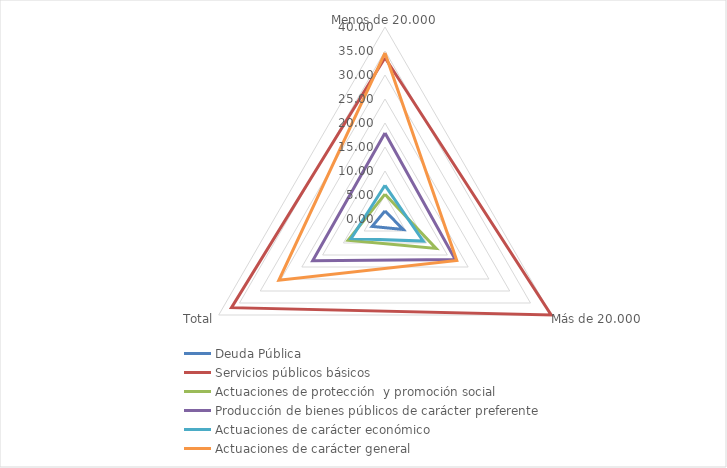
| Category | Deuda Pública | Servicios públicos básicos | Actuaciones de protección  y promoción social | Producción de bienes públicos de carácter preferente | Actuaciones de carácter económico | Actuaciones de carácter general |
|---|---|---|---|---|---|---|
| Menos de 20.000 | 1.688 | 33.591 | 5.173 | 17.935 | 7.023 | 34.591 |
| Más de 20.000 | 4.367 | 39.975 | 12.289 | 16.905 | 9.197 | 17.268 |
| Total | 3.088 | 36.927 | 8.892 | 17.397 | 8.159 | 25.537 |